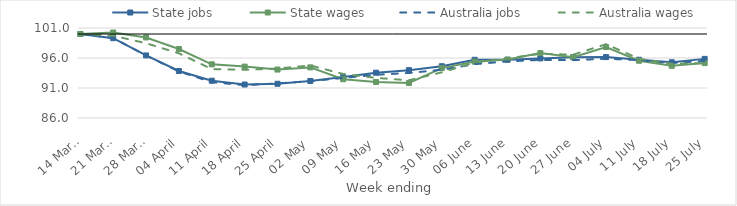
| Category | State jobs | State wages | Australia jobs | Australia wages |
|---|---|---|---|---|
| 2020-03-14 | 100 | 100 | 100 | 100 |
| 2020-03-21 | 99.303 | 100.243 | 99.322 | 99.708 |
| 2020-03-28 | 96.429 | 99.424 | 96.426 | 98.464 |
| 2020-04-04 | 93.83 | 97.495 | 93.761 | 96.774 |
| 2020-04-11 | 92.209 | 94.943 | 91.978 | 94.155 |
| 2020-04-18 | 91.582 | 94.563 | 91.464 | 94.034 |
| 2020-04-25 | 91.705 | 94.073 | 91.766 | 94.248 |
| 2020-05-02 | 92.172 | 94.435 | 92.148 | 94.747 |
| 2020-05-09 | 92.833 | 92.462 | 92.676 | 93.34 |
| 2020-05-16 | 93.55 | 92.007 | 93.207 | 92.686 |
| 2020-05-23 | 93.973 | 91.852 | 93.505 | 92.29 |
| 2020-05-30 | 94.631 | 94.318 | 94.037 | 93.611 |
| 2020-06-06 | 95.702 | 95.395 | 94.972 | 95.238 |
| 2020-06-13 | 95.704 | 95.736 | 95.44 | 95.935 |
| 2020-06-20 | 95.93 | 96.815 | 95.683 | 96.696 |
| 2020-06-27 | 96.139 | 96.135 | 95.641 | 96.56 |
| 2020-07-04 | 96.15 | 97.83 | 95.882 | 98.301 |
| 2020-07-11 | 95.706 | 95.543 | 95.648 | 95.883 |
| 2020-07-18 | 95.289 | 94.698 | 95.158 | 95.058 |
| 2020-07-25 | 95.855 | 95.15 | 95.522 | 95.15 |